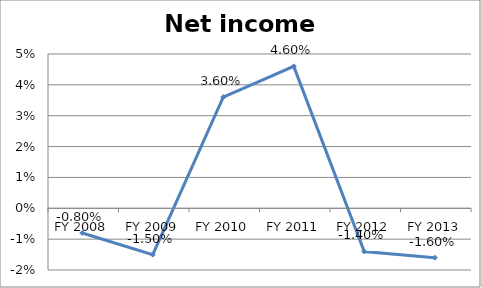
| Category | Net income ratio |
|---|---|
| FY 2013 | -0.016 |
| FY 2012 | -0.014 |
| FY 2011 | 0.046 |
| FY 2010 | 0.036 |
| FY 2009 | -0.015 |
| FY 2008 | -0.008 |